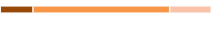
| Category | Series 0 | Series 1 | Series 2 |
|---|---|---|---|
| 0 | 0.155 | 0.648 | 0.197 |